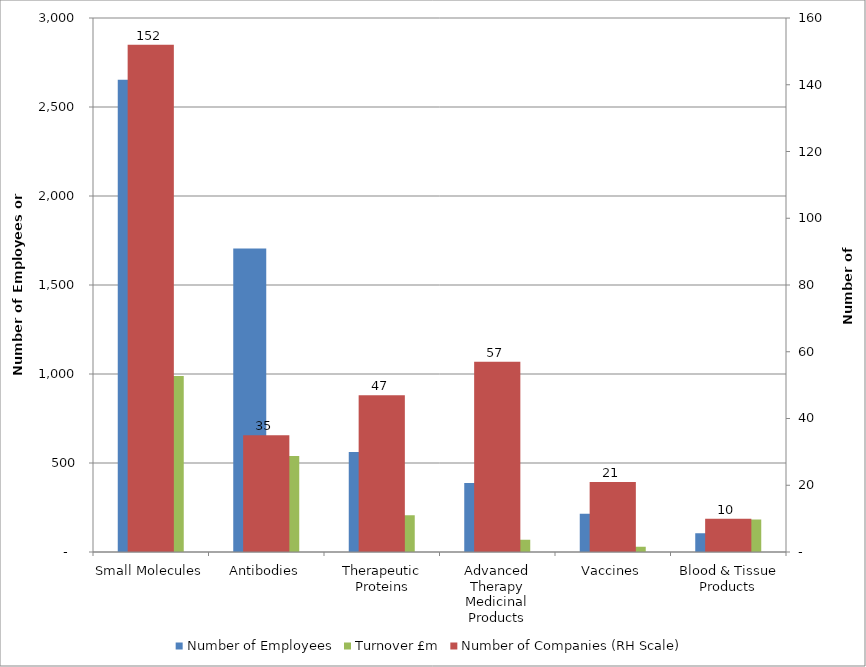
| Category | Number of Employees | Turnover £m |
|---|---|---|
| Small Molecules | 2653.2 | 989 |
| Antibodies | 1705.6 | 539.271 |
| Therapeutic Proteins | 562 | 206.622 |
| Advanced Therapy Medicinal Products | 387 | 68.869 |
| Vaccines | 214.4 | 29.468 |
| Blood & Tissue Products | 106 | 182 |